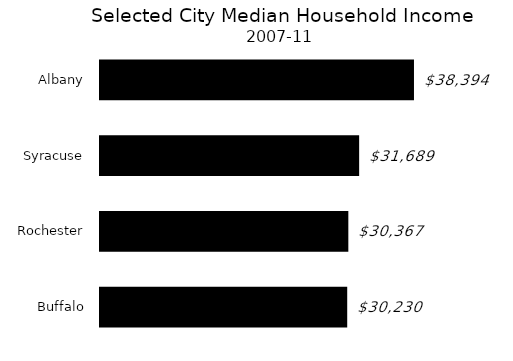
| Category | Series 0 |
|---|---|
| Buffalo | 30230 |
| Rochester | 30367 |
| Syracuse | 31689 |
| Albany | 38394 |